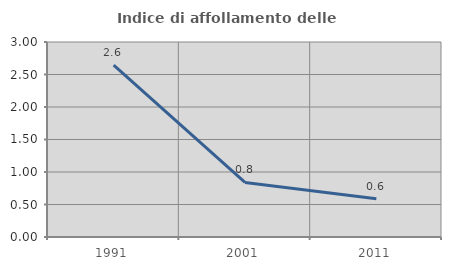
| Category | Indice di affollamento delle abitazioni  |
|---|---|
| 1991.0 | 2.644 |
| 2001.0 | 0.839 |
| 2011.0 | 0.59 |